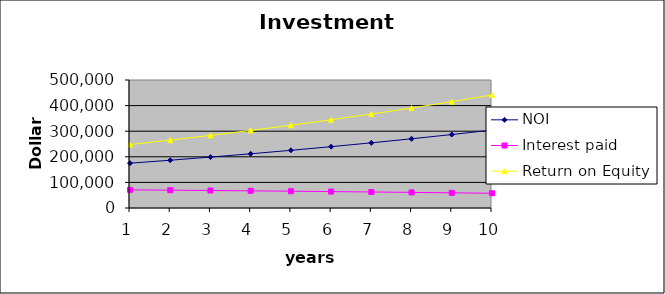
| Category | NOI | Interest paid | Return on Equity |
|---|---|---|---|
| 0 | 175000 | 70847.66 | 247679.365 |
| 1 | 186630 | 69609.713 | 265186.929 |
| 2 | 198870.3 | 68318.759 | 283583.806 |
| 3 | 211751.703 | 66972.529 | 302914.399 |
| 4 | 225306.555 | 65568.656 | 323225.319 |
| 5 | 239568.822 | 64104.672 | 344565.498 |
| 6 | 254574.172 | 62578.003 | 366986.305 |
| 7 | 270360.059 | 60985.965 | 390541.665 |
| 8 | 286965.812 | 59325.759 | 415288.189 |
| 9 | 304432.73 | 57594.467 | 441285.308 |